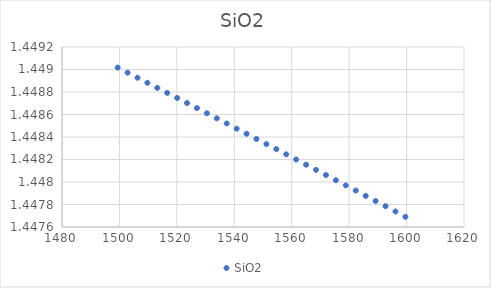
| Category | SiO2 |
|---|---|
| 1499.383911 | 1.449 |
| 1502.834839 | 1.449 |
| 1506.286133 | 1.449 |
| 1509.737671 | 1.449 |
| 1513.189697 | 1.449 |
| 1516.641846 | 1.449 |
| 1520.094482 | 1.449 |
| 1523.547241 | 1.449 |
| 1527.000488 | 1.449 |
| 1530.453979 | 1.449 |
| 1533.907959 | 1.449 |
| 1537.362061 | 1.449 |
| 1540.81665 | 1.448 |
| 1544.271362 | 1.448 |
| 1547.726563 | 1.448 |
| 1551.182007 | 1.448 |
| 1554.637939 | 1.448 |
| 1558.093994 | 1.448 |
| 1561.550537 | 1.448 |
| 1565.007202 | 1.448 |
| 1568.464478 | 1.448 |
| 1571.921875 | 1.448 |
| 1575.379639 | 1.448 |
| 1578.837769 | 1.448 |
| 1582.296265 | 1.448 |
| 1585.755127 | 1.448 |
| 1589.214233 | 1.448 |
| 1592.673706 | 1.448 |
| 1596.133545 | 1.448 |
| 1599.593628 | 1.448 |